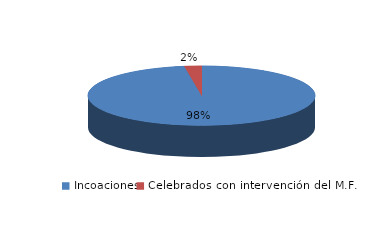
| Category | Series 0 |
|---|---|
| Incoaciones | 8602 |
| Celebrados con intervención del M.F. | 214 |